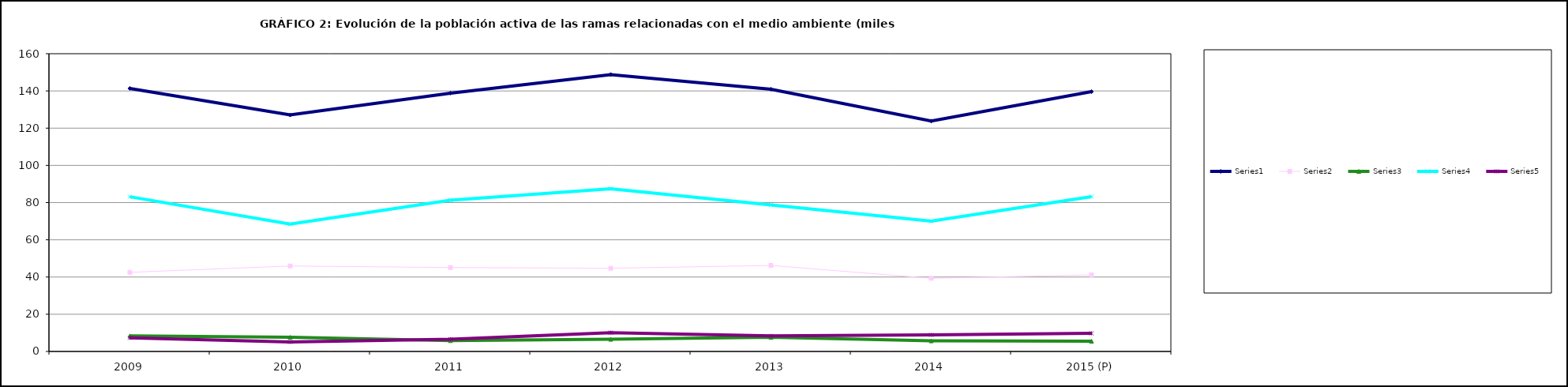
| Category | Series 0 | Series 1 | Series 2 | Series 3 | Series 4 |
|---|---|---|---|---|---|
| 2009 | 141.35 | 42.525 | 8.35 | 83.125 | 7.325 |
| 2010 | 127.075 | 45.925 | 7.65 | 68.45 | 5.1 |
| 2011 | 138.825 | 45.1 | 5.825 | 81.275 | 6.6 |
| 2012 | 148.8 | 44.7 | 6.55 | 87.45 | 10.125 |
| 2013 | 140.925 | 46.225 | 7.625 | 78.75 | 8.35 |
| 2014 | 123.8 | 39.3 | 5.7 | 70 | 8.9 |
| 2015 (P) | 139.625 | 41.15 | 5.5 | 83.225 | 9.75 |